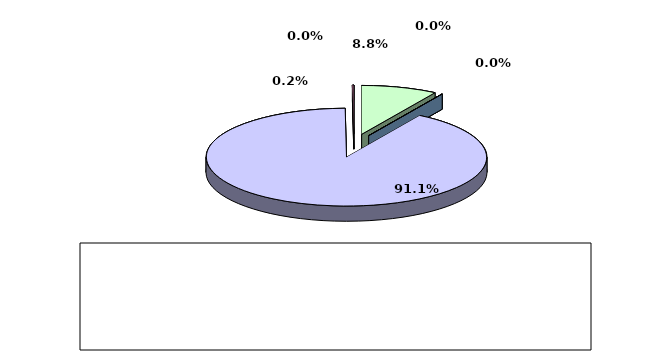
| Category | Series 0 |
|---|---|
| מזומנים ושווי מזומנים | 0.088 |
| אג"ח ממשלתיות סחירות | 0 |
| אג"ח קונצרני סחיר | 0 |
| ני"ע אחרים סחירים | 0.911 |
| פקדונות והלוואות | 0 |
| השקעות אחרות | 0.002 |